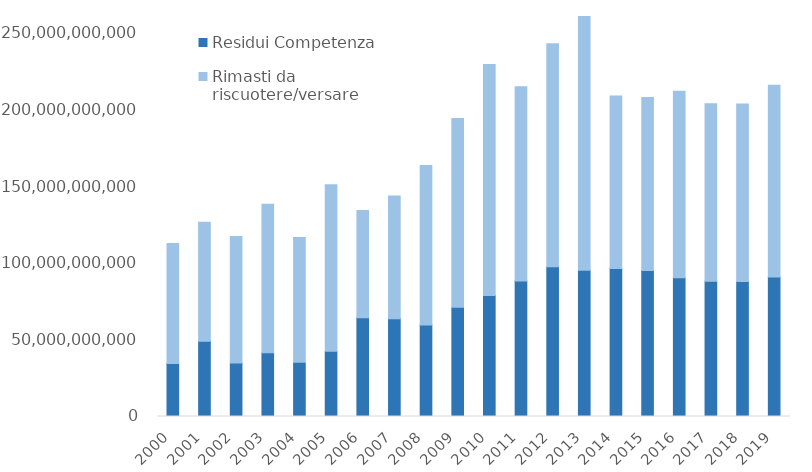
| Category | Residui Competenza | Rimasti da riscuotere/versare |
|---|---|---|
| 2000.0 | 34622000000 | 78241000000 |
| 2001.0 | 49078000000 | 77645000000 |
| 2002.0 | 34859000000 | 82558000000 |
| 2003.0 | 41541000000 | 97010000000 |
| 2004.0 | 35336000000 | 81520000000 |
| 2005.0 | 42585000000 | 108663000000 |
| 2006.0 | 64493000000 | 69956000000 |
| 2007.0 | 63839000000 | 80040000000 |
| 2008.0 | 59774000000 | 104078000000 |
| 2009.0 | 71339000000 | 123212000000 |
| 2010.0 | 79027000000 | 150763000000 |
| 2011.0 | 88501177224.53 | 126705683786.92 |
| 2012.0 | 97722496035.36 | 145555133496.4 |
| 2013.0 | 95474967421.77 | 165648754557.97 |
| 2014.0 | 96564619074.06 | 112561805601.2 |
| 2015.0 | 95352231735.89 | 112907310816.49 |
| 2016.0 | 90634161431.03 | 121603863303.76 |
| 2017.0 | 88262733034.44 | 115813040456.62 |
| 2018.0 | 88099784764.28 | 115839933548 |
| 2019.0 | 91065752698.81 | 125095288190.88 |